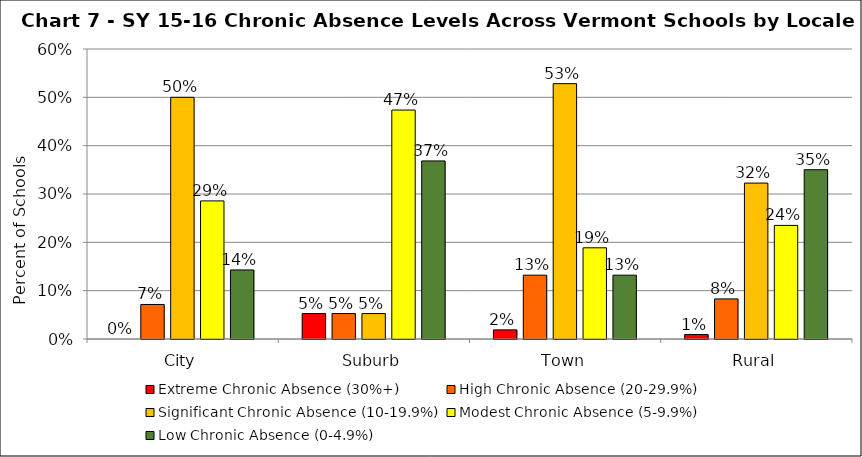
| Category | Extreme Chronic Absence (30%+) | High Chronic Absence (20-29.9%) | Significant Chronic Absence (10-19.9%) | Modest Chronic Absence (5-9.9%) | Low Chronic Absence (0-4.9%) |
|---|---|---|---|---|---|
| 0 | 0 | 0.071 | 0.5 | 0.286 | 0.143 |
| 1 | 0.053 | 0.053 | 0.053 | 0.474 | 0.368 |
| 2 | 0.019 | 0.132 | 0.528 | 0.189 | 0.132 |
| 3 | 0.009 | 0.083 | 0.323 | 0.235 | 0.35 |